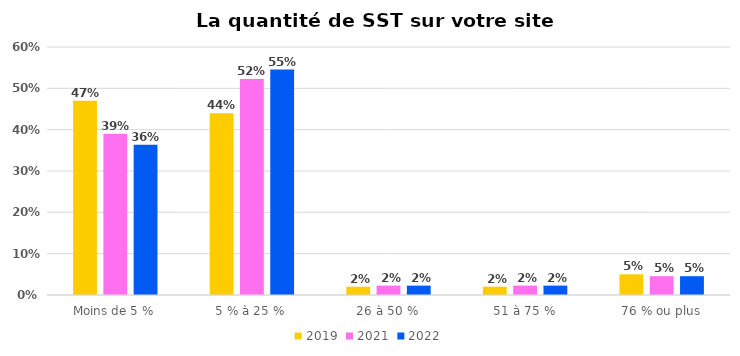
| Category | 2019 | 2021 | 2022 |
|---|---|---|---|
| Moins de 5 % | 0.47 | 0.39 | 0.364 |
| 5 % à 25 % | 0.44 | 0.523 | 0.546 |
| 26 à 50 % | 0.02 | 0.023 | 0.023 |
| 51 à 75 % | 0.02 | 0.023 | 0.023 |
| 76 % ou plus | 0.05 | 0.046 | 0.046 |